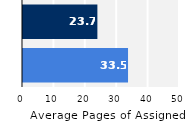
| Category | Series 0 |
|---|---|
| Upper Division | 33.45 |
| Lower Division | 23.69 |